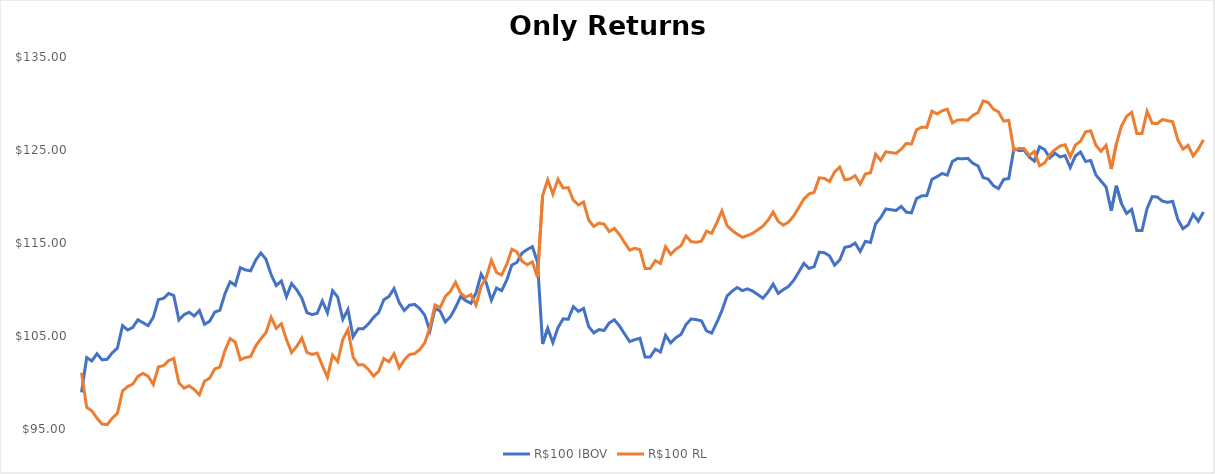
| Category | R$100 IBOV | R$100 RL |
|---|---|---|
| 0 | 98.941 | 101.059 |
| 1 | 102.675 | 97.325 |
| 2 | 102.311 | 96.961 |
| 3 | 103.093 | 96.179 |
| 4 | 102.439 | 95.525 |
| 5 | 102.496 | 95.468 |
| 6 | 103.196 | 96.168 |
| 7 | 103.701 | 96.674 |
| 8 | 106.116 | 99.088 |
| 9 | 105.644 | 99.561 |
| 10 | 105.925 | 99.842 |
| 11 | 106.745 | 100.661 |
| 12 | 106.428 | 100.978 |
| 13 | 106.117 | 100.668 |
| 14 | 107.009 | 99.777 |
| 15 | 108.912 | 101.68 |
| 16 | 109.05 | 101.818 |
| 17 | 109.584 | 102.351 |
| 18 | 109.346 | 102.589 |
| 19 | 106.723 | 99.966 |
| 20 | 107.297 | 99.392 |
| 21 | 107.552 | 99.647 |
| 22 | 107.154 | 99.249 |
| 23 | 107.737 | 98.667 |
| 24 | 106.257 | 100.146 |
| 25 | 106.579 | 100.468 |
| 26 | 107.57 | 101.459 |
| 27 | 107.77 | 101.659 |
| 28 | 109.556 | 103.445 |
| 29 | 110.831 | 104.72 |
| 30 | 110.45 | 104.339 |
| 31 | 112.343 | 102.446 |
| 32 | 112.105 | 102.684 |
| 33 | 112.008 | 102.782 |
| 34 | 113.166 | 103.94 |
| 35 | 113.924 | 104.698 |
| 36 | 113.254 | 105.367 |
| 37 | 111.608 | 107.013 |
| 38 | 110.424 | 105.828 |
| 39 | 110.915 | 106.319 |
| 40 | 109.222 | 104.626 |
| 41 | 110.635 | 103.212 |
| 42 | 109.969 | 103.879 |
| 43 | 109.066 | 104.781 |
| 44 | 107.509 | 103.224 |
| 45 | 107.303 | 103.018 |
| 46 | 107.443 | 103.158 |
| 47 | 108.771 | 101.83 |
| 48 | 107.497 | 100.555 |
| 49 | 109.871 | 102.929 |
| 50 | 109.188 | 102.247 |
| 51 | 106.797 | 104.638 |
| 52 | 107.847 | 105.688 |
| 53 | 104.912 | 102.753 |
| 54 | 105.771 | 101.894 |
| 55 | 105.787 | 101.91 |
| 56 | 106.295 | 101.402 |
| 57 | 107.006 | 100.691 |
| 58 | 107.523 | 101.207 |
| 59 | 108.896 | 102.581 |
| 60 | 109.246 | 102.231 |
| 61 | 110.101 | 103.087 |
| 62 | 108.59 | 101.576 |
| 63 | 107.738 | 102.428 |
| 64 | 108.314 | 103.004 |
| 65 | 108.402 | 103.092 |
| 66 | 107.954 | 103.541 |
| 67 | 107.227 | 104.268 |
| 68 | 105.558 | 105.937 |
| 69 | 107.96 | 108.338 |
| 70 | 107.686 | 108.065 |
| 71 | 106.514 | 109.237 |
| 72 | 107.073 | 109.795 |
| 73 | 108.058 | 110.78 |
| 74 | 109.236 | 109.601 |
| 75 | 108.797 | 109.162 |
| 76 | 108.512 | 109.448 |
| 77 | 109.635 | 108.325 |
| 78 | 111.651 | 110.342 |
| 79 | 110.71 | 111.283 |
| 80 | 108.848 | 113.146 |
| 81 | 110.153 | 111.84 |
| 82 | 109.873 | 111.56 |
| 83 | 111.021 | 112.707 |
| 84 | 112.638 | 114.325 |
| 85 | 112.918 | 114.046 |
| 86 | 113.93 | 113.033 |
| 87 | 114.3 | 112.663 |
| 88 | 114.606 | 112.97 |
| 89 | 112.941 | 111.305 |
| 90 | 104.142 | 120.104 |
| 91 | 105.833 | 121.795 |
| 92 | 104.291 | 120.253 |
| 93 | 105.895 | 121.857 |
| 94 | 106.844 | 120.907 |
| 95 | 106.797 | 120.955 |
| 96 | 108.154 | 119.598 |
| 97 | 107.648 | 119.092 |
| 98 | 107.963 | 119.407 |
| 99 | 106.008 | 117.452 |
| 100 | 105.335 | 116.779 |
| 101 | 105.691 | 117.135 |
| 102 | 105.594 | 117.037 |
| 103 | 106.402 | 116.229 |
| 104 | 106.745 | 116.572 |
| 105 | 106.088 | 115.915 |
| 106 | 105.22 | 115.047 |
| 107 | 104.398 | 114.225 |
| 108 | 104.608 | 114.434 |
| 109 | 104.76 | 114.282 |
| 110 | 102.747 | 112.27 |
| 111 | 102.741 | 112.263 |
| 112 | 103.58 | 113.102 |
| 113 | 103.278 | 112.801 |
| 114 | 105.08 | 114.603 |
| 115 | 104.255 | 113.778 |
| 116 | 104.812 | 114.334 |
| 117 | 105.168 | 114.69 |
| 118 | 106.23 | 115.752 |
| 119 | 106.834 | 115.148 |
| 120 | 106.758 | 115.073 |
| 121 | 106.635 | 115.196 |
| 122 | 105.552 | 116.279 |
| 123 | 105.315 | 116.042 |
| 124 | 106.443 | 117.17 |
| 125 | 107.723 | 118.45 |
| 126 | 109.296 | 116.878 |
| 127 | 109.824 | 116.35 |
| 128 | 110.22 | 115.954 |
| 129 | 109.877 | 115.612 |
| 130 | 110.07 | 115.805 |
| 131 | 109.829 | 116.047 |
| 132 | 109.457 | 116.418 |
| 133 | 109.066 | 116.809 |
| 134 | 109.709 | 117.453 |
| 135 | 110.582 | 118.325 |
| 136 | 109.581 | 117.325 |
| 137 | 109.99 | 116.915 |
| 138 | 110.327 | 117.252 |
| 139 | 110.973 | 117.898 |
| 140 | 111.877 | 118.802 |
| 141 | 112.81 | 119.734 |
| 142 | 112.275 | 120.269 |
| 143 | 112.456 | 120.45 |
| 144 | 114.014 | 122.008 |
| 145 | 113.953 | 121.948 |
| 146 | 113.617 | 121.612 |
| 147 | 112.614 | 122.615 |
| 148 | 113.162 | 123.163 |
| 149 | 114.537 | 121.788 |
| 150 | 114.639 | 121.891 |
| 151 | 114.989 | 122.241 |
| 152 | 114.089 | 121.341 |
| 153 | 115.175 | 122.427 |
| 154 | 115.059 | 122.543 |
| 155 | 117.063 | 124.548 |
| 156 | 117.73 | 123.881 |
| 157 | 118.66 | 124.81 |
| 158 | 118.577 | 124.727 |
| 159 | 118.497 | 124.647 |
| 160 | 118.937 | 125.088 |
| 161 | 118.315 | 125.71 |
| 162 | 118.243 | 125.638 |
| 163 | 119.779 | 127.174 |
| 164 | 120.065 | 127.461 |
| 165 | 120.096 | 127.43 |
| 166 | 121.844 | 129.178 |
| 167 | 122.14 | 128.882 |
| 168 | 122.474 | 129.216 |
| 169 | 122.298 | 129.391 |
| 170 | 123.772 | 127.918 |
| 171 | 124.079 | 128.225 |
| 172 | 124.058 | 128.246 |
| 173 | 124.098 | 128.207 |
| 174 | 123.572 | 128.733 |
| 175 | 123.289 | 129.016 |
| 176 | 122.032 | 130.272 |
| 177 | 121.866 | 130.106 |
| 178 | 121.163 | 129.403 |
| 179 | 120.852 | 129.092 |
| 180 | 121.84 | 128.104 |
| 181 | 121.929 | 128.192 |
| 182 | 125.16 | 124.961 |
| 183 | 124.936 | 125.185 |
| 184 | 124.972 | 125.15 |
| 185 | 124.237 | 124.415 |
| 186 | 123.806 | 124.846 |
| 187 | 125.351 | 123.301 |
| 188 | 125.042 | 123.609 |
| 189 | 124.144 | 124.508 |
| 190 | 124.655 | 125.02 |
| 191 | 124.253 | 125.422 |
| 192 | 124.395 | 125.563 |
| 193 | 123.115 | 124.283 |
| 194 | 124.357 | 125.526 |
| 195 | 124.778 | 125.946 |
| 196 | 123.767 | 126.957 |
| 197 | 123.872 | 127.062 |
| 198 | 122.324 | 125.514 |
| 199 | 121.667 | 124.857 |
| 200 | 121.015 | 125.508 |
| 201 | 118.464 | 122.957 |
| 202 | 121.154 | 125.647 |
| 203 | 119.228 | 127.572 |
| 204 | 118.179 | 128.621 |
| 205 | 118.607 | 129.049 |
| 206 | 116.333 | 126.776 |
| 207 | 116.333 | 126.776 |
| 208 | 118.713 | 129.155 |
| 209 | 119.988 | 127.879 |
| 210 | 119.945 | 127.836 |
| 211 | 119.502 | 128.279 |
| 212 | 119.37 | 128.147 |
| 213 | 119.479 | 128.038 |
| 214 | 117.537 | 126.095 |
| 215 | 116.534 | 125.092 |
| 216 | 116.942 | 125.5 |
| 217 | 118.085 | 124.357 |
| 218 | 117.34 | 125.101 |
| 219 | 118.335 | 126.096 |